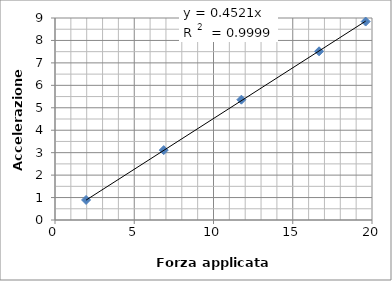
| Category | Series 0 |
|---|---|
| 1.9600000000000002 | 0.894 |
| 6.86 | 3.113 |
| 11.76 | 5.361 |
| 16.66 | 7.516 |
| 19.6 | 8.842 |